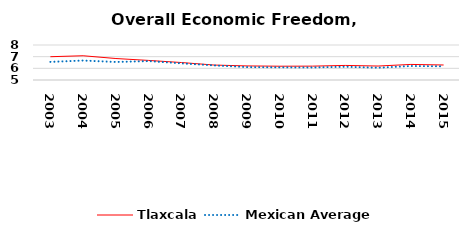
| Category | Tlaxcala | Mexican Average  |
|---|---|---|
| 2003.0 | 6.996 | 6.552 |
| 2004.0 | 7.078 | 6.668 |
| 2005.0 | 6.841 | 6.546 |
| 2006.0 | 6.677 | 6.619 |
| 2007.0 | 6.497 | 6.428 |
| 2008.0 | 6.281 | 6.248 |
| 2009.0 | 6.206 | 6.106 |
| 2010.0 | 6.181 | 6.086 |
| 2011.0 | 6.189 | 6.074 |
| 2012.0 | 6.248 | 6.134 |
| 2013.0 | 6.197 | 6.054 |
| 2014.0 | 6.334 | 6.2 |
| 2015.0 | 6.286 | 6.174 |